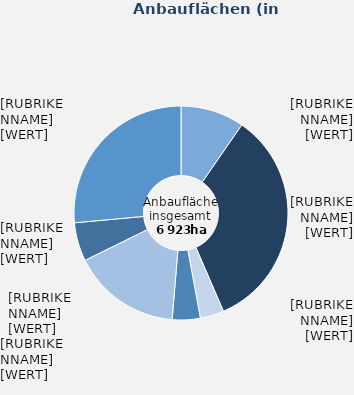
| Category | Anbauflächen |
|---|---|
| Rotkohl | 666 |
| Weißkohl | 2347 |
| Wirsing | 248 |
| Blumenkohl | 293 |
| Speisemöhren/ Karotten | 1134 |
| Spargel im Ertrag stehend | 404 |
| Sonstige | 1832 |